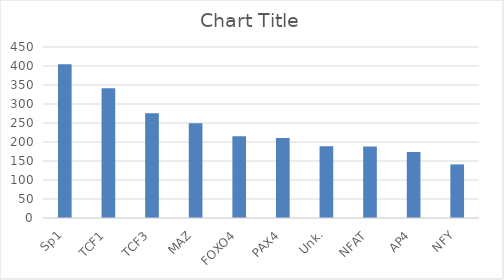
| Category | Series 0 |
|---|---|
| Sp1 | 404.93 |
| TCF1 | 341.769 |
| TCF3 | 275.518 |
| MAZ | 249.579 |
| FOXO4 | 215.177 |
| PAX4 | 210.523 |
| Unk. | 188.983 |
| NFAT | 188.022 |
| AP4 | 173.764 |
| NFY | 141.023 |